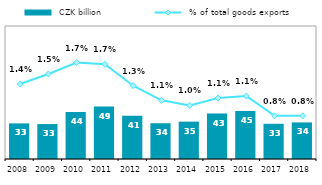
| Category |  CZK billion |
|---|---|
| 2008.0 | 33.466 |
| 2009.0 | 32.812 |
| 2010.0 | 44.08 |
| 2011.0 | 49.246 |
| 2012.0 | 40.656 |
| 2013.0 | 33.61 |
| 2014.0 | 35.112 |
| 2015.0 | 42.707 |
| 2016.0 | 45.144 |
| 2017.0 | 33.101 |
| 2018.0 | 34.371 |